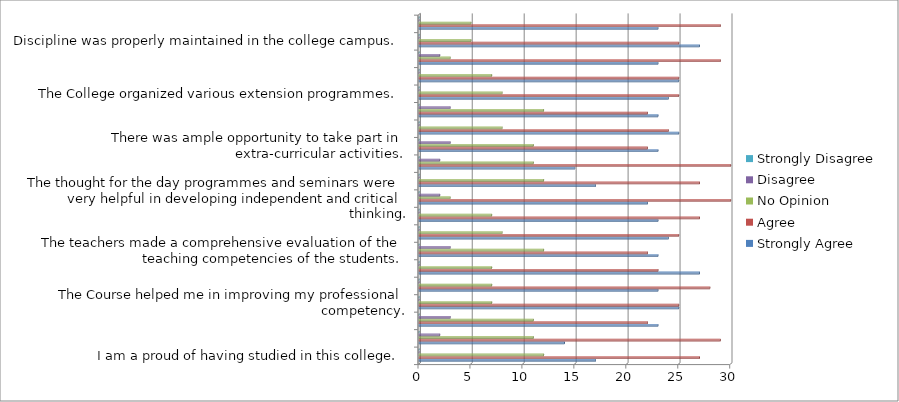
| Category | Strongly Agree  | Agree | No Opinion  | Disagree | Strongly Disagree  |
|---|---|---|---|---|---|
| I am a proud of having studied in this college. | 17 | 27 | 12 | 0 | 0 |
| There existed cordial relation between the staff and students.  | 14 | 29 | 11 | 2 | 0 |
| The institution helped me to fulfill my ambition of becoming a teacher. | 23 | 22 | 11 | 3 | 0 |
| The Course helped me in improving my professional competency. | 25 | 25 | 7 | 0 | 0 |
| The internal assessment of this college is balanced and objective. | 23 | 28 | 7 | 0 | 0 |
| The library facilities are adequate. | 27 | 23 | 7 | 0 | 0 |
| The teachers made a comprehensive evaluation of the teaching competencies of the students. | 23 | 22 | 12 | 3 | 0 |
| The teachers devoted extra time to render guidance. | 24 | 25 | 8 | 0 | 0 |
| Teacher adopted several innovative practices while teaching. | 23 | 27 | 7 | 0 | 0 |
| The thought for the day programmes and seminars were very helpful in developing independent and critical thinking. | 22 | 30 | 3 | 2 | 0 |
| The infrastructure facilities were adequate. | 17 | 27 | 12 | 0 | 0 |
| The educational tour proved to be informative. | 15 | 30 | 11 | 2 | 0 |
| There was ample opportunity to take part in extra-curricular activities. | 23 | 22 | 11 | 3 | 0 |
|  | 25 | 24 | 8 | 0 | 0 |
| There are adequate facilities for physical training and games. | 23 | 22 | 12 | 3 | 0 |
| The College organized various extension programmes. | 24 | 25 | 8 | 0 | 0 |
| The organization of various clubs in the college encouraged me to develop my intellectual and social skill. | 25 | 25 | 7 | 0 | 0 |
| Top Scores in the University Examination are felicitated. | 23 | 29 | 3 | 2 | 0 |
| Discipline was properly maintained in the college campus. | 27 | 25 | 5 | 0 | 0 |
| I often cherished glorious moments of my life in the college. | 23 | 29 | 5 | 0 | 0 |